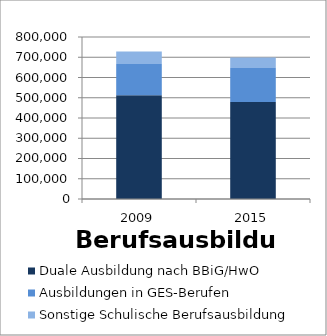
| Category | Duale Ausbildung nach BBiG/HwO | Ausbildungen in GES-Berufen | Sonstige Schulische Berufsausbildung |
|---|---|---|---|
| 2009.0 | 512518 | 153840 | 62126 |
| 2015.0 | 479545.314 | 167330 | 51543.569 |